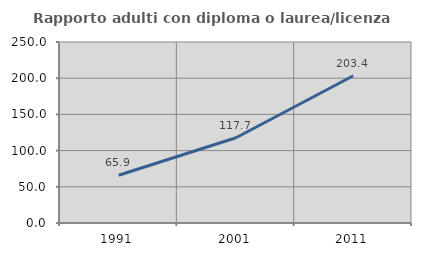
| Category | Rapporto adulti con diploma o laurea/licenza media  |
|---|---|
| 1991.0 | 65.937 |
| 2001.0 | 117.689 |
| 2011.0 | 203.354 |